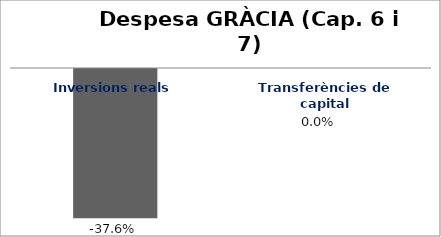
| Category | Series 0 |
|---|---|
| Inversions reals | -0.376 |
| Transferències de capital | 0 |